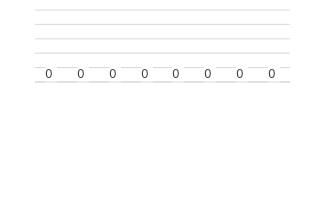
| Category | f |
|---|---|
| Pengurusan | 0 |
| Perubatan | 0 |
| Kesihatan Awam | 0 |
| Penyelidikan & S. Teknikal | 0 |
| Pergigian | 0 |
| Farmasi | 0 |
| Keselamatan & Kualiti Makanan | 0 |
| Tidak Dinyatakan | 0 |